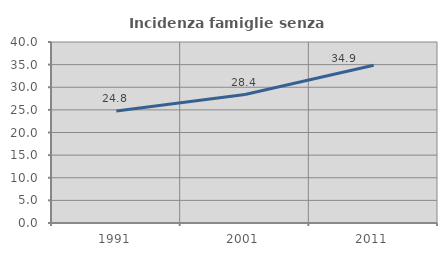
| Category | Incidenza famiglie senza nuclei |
|---|---|
| 1991.0 | 24.776 |
| 2001.0 | 28.382 |
| 2011.0 | 34.864 |